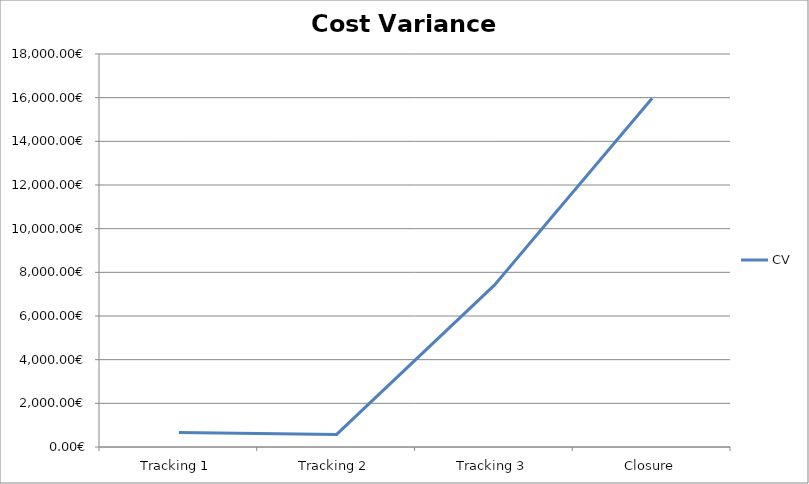
| Category | CV |
|---|---|
| Tracking 1 | 663 |
| Tracking 2 | 576 |
| Tracking 3 | 7410.15 |
| Closure | 15975 |